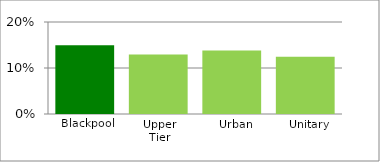
| Category | Series 1 |
|---|---|
| Blackpool | 0.15 |
| Upper Tier | 0.129 |
| Urban | 0.138 |
| Unitary | 0.125 |